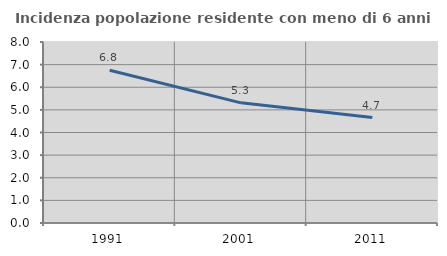
| Category | Incidenza popolazione residente con meno di 6 anni |
|---|---|
| 1991.0 | 6.753 |
| 2001.0 | 5.311 |
| 2011.0 | 4.661 |